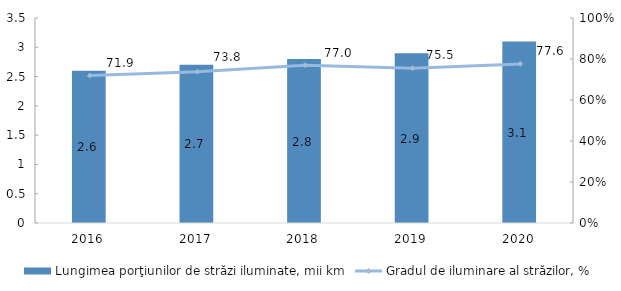
| Category | Lungimea porţiunilor de străzi iluminate, mii km |
|---|---|
| 2016.0 | 2.6 |
| 2017.0 | 2.7 |
| 2018.0 | 2.8 |
| 2019.0 | 2.9 |
| 2020.0 | 3.1 |